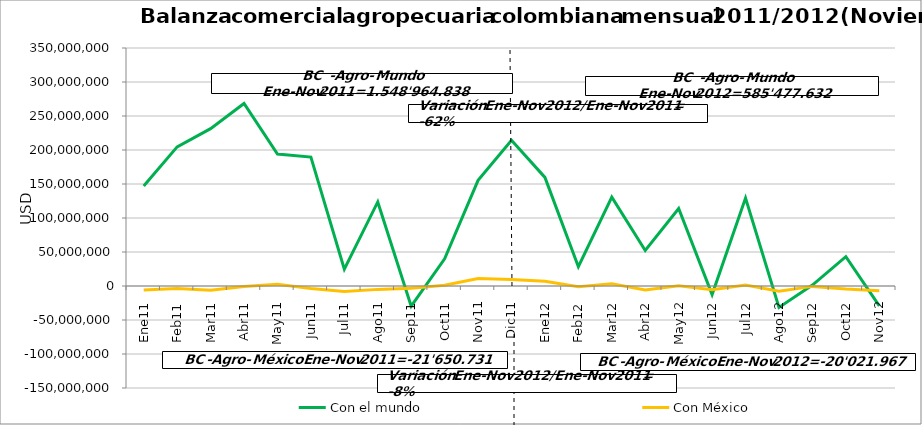
| Category | Con el mundo | Con México |
|---|---|---|
| 0 | 147170268.9 | -5854609.52 |
| 1 | 204650116.66 | -3520281.1 |
| 2 | 231423347.81 | -6161964.3 |
| 3 | 268381287.56 | -697842.23 |
| 4 | 193958950.79 | 2434633.53 |
| 5 | 189518018.45 | -3637120.58 |
| 6 | 24694762.16 | -7973581.44 |
| 7 | 123602889.05 | -4965729.34 |
| 8 | -29681100.27 | -3239057.57 |
| 9 | 39906361.62 | 976589.29 |
| 10 | 155339935.17 | 10988232.54 |
| 11 | 214358903.69 | 9390285.96 |
| 12 | 159718811.51 | 7072773.63 |
| 13 | 28364992.2 | -1129133.58 |
| 14 | 130703935.59 | 3384595.02 |
| 15 | 52247887.52 | -5866691.5 |
| 16 | 113869665.14 | 208083.32 |
| 17 | -12554667.46 | -5450457.26 |
| 18 | 129307489.88 | 1379725.25 |
| 19 | -31469488.76 | -7599955.08 |
| 20 | 1432890.8 | -563973.1 |
| 21 | 43089965.32 | -4397614.27 |
| 22 | -29233849.86 | -7059319.84 |